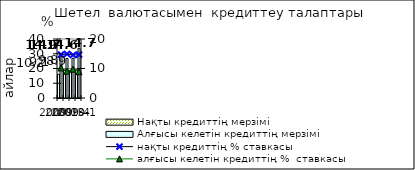
| Category | Нақты кредиттің мерзімі  | Алғысы келетін кредиттің мерзімі  |
|---|---|---|
| 2009-2 | 16.11 | 29.71 |
| 2009-3 | 18.77 | 26.82 |
| 2009-4 | 18.61 | 26.91 |
| 2010-1 | 19.11 | 33.71 |